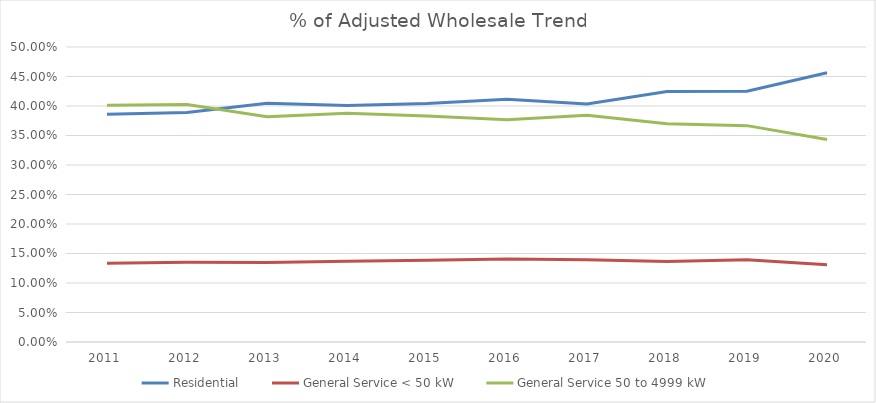
| Category | Residential | General Service < 50 kW | General Service 50 to 4999 kW |
|---|---|---|---|
| 2011.0 | 0.386 | 0.133 | 0.401 |
| 2012.0 | 0.389 | 0.135 | 0.403 |
| 2013.0 | 0.405 | 0.135 | 0.382 |
| 2014.0 | 0.401 | 0.137 | 0.388 |
| 2015.0 | 0.404 | 0.139 | 0.383 |
| 2016.0 | 0.411 | 0.141 | 0.377 |
| 2017.0 | 0.403 | 0.139 | 0.384 |
| 2018.0 | 0.425 | 0.136 | 0.37 |
| 2019.0 | 0.425 | 0.139 | 0.367 |
| 2020.0 | 0.456 | 0.131 | 0.343 |